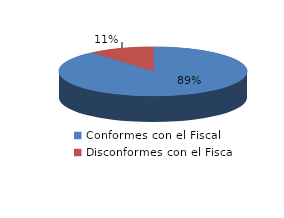
| Category | Series 0 |
|---|---|
| 0 | 56 |
| 1 | 7 |